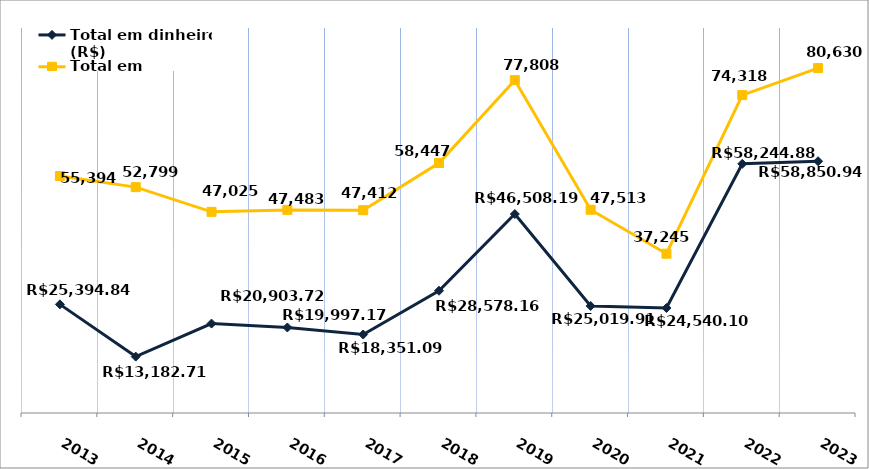
| Category | Total em dinheiro (R$) |
|---|---|
| 2013.0 | 25394.84 |
| 2014.0 | 13182.71 |
| 2015.0 | 20903.72 |
| 2016.0 | 19997.17 |
| 2017.0 | 18351.09 |
| 2018.0 | 28578.16 |
| 2019.0 | 46508.19 |
| 2020.0 | 25019.91 |
| 2021.0 | 24540.1 |
| 2022.0 | 58244.88 |
| 2023.0 | 58850.94 |